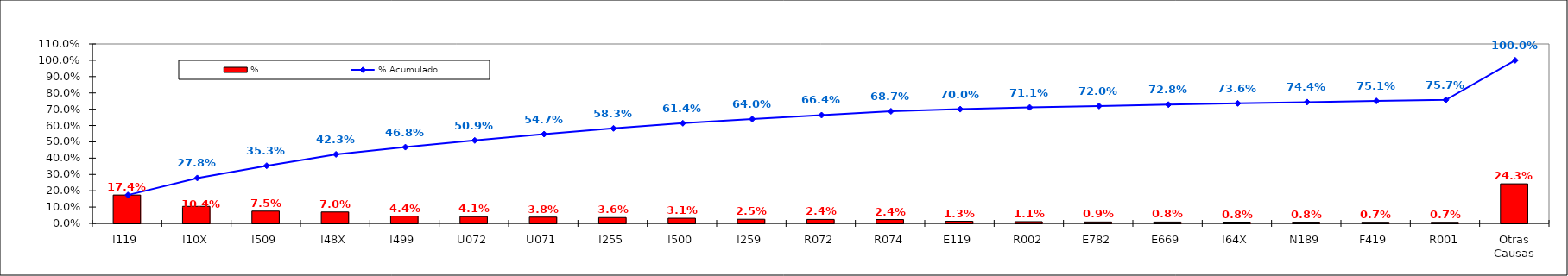
| Category | % |
|---|---|
| I119 | 0.174 |
| I10X | 0.104 |
| I509 | 0.075 |
| I48X | 0.07 |
| I499 | 0.044 |
| U072 | 0.041 |
| U071 | 0.038 |
| I255 | 0.036 |
| I500 | 0.031 |
| I259 | 0.025 |
| R072 | 0.024 |
| R074 | 0.024 |
| E119 | 0.013 |
| R002 | 0.011 |
| E782 | 0.009 |
| E669 | 0.008 |
| I64X | 0.008 |
| N189 | 0.008 |
| F419 | 0.007 |
| R001 | 0.007 |
| Otras Causas | 0.243 |